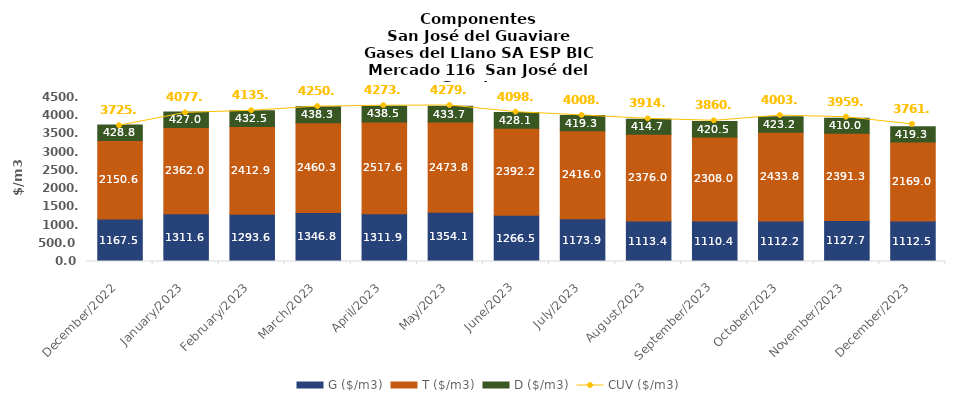
| Category | G ($/m3) | T ($/m3) | D ($/m3) |
|---|---|---|---|
| 2022-12-01 | 1167.54 | 2150.64 | 428.78 |
| 2023-01-01 | 1311.57 | 2362.01 | 427.02 |
| 2023-02-01 | 1293.59 | 2412.88 | 432.47 |
| 2023-03-01 | 1346.83 | 2460.32 | 438.26 |
| 2023-04-01 | 1311.89 | 2517.58 | 438.54 |
| 2023-05-01 | 1354.14 | 2473.76 | 433.72 |
| 2023-06-01 | 1266.52 | 2392.24 | 428.13 |
| 2023-07-01 | 1173.91 | 2415.98 | 419.29 |
| 2023-08-01 | 1113.38 | 2375.96 | 414.65 |
| 2023-09-01 | 1110.42 | 2307.98 | 420.53 |
| 2023-10-01 | 1112.24 | 2433.8 | 423.16 |
| 2023-11-01 | 1127.7 | 2391.33 | 410 |
| 2023-12-01 | 1112.49 | 2169.04 | 419.27 |